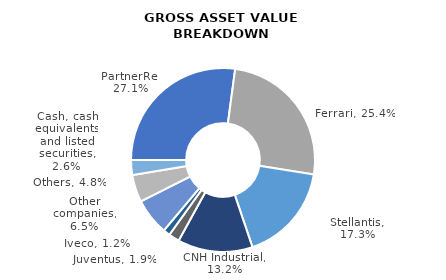
| Category | 30/06/2022 |
|---|---|
| PartnerRe | 8311 |
| Ferrari | 7785 |
| Stellantis | 5299 |
| CNH Industrial | 4044 |
| Juventus | 582 |
| Iveco | 370 |
| Other companies | 1982 |
| Others | 1470 |
| Cash, cash equivalents and listed securities | 804 |